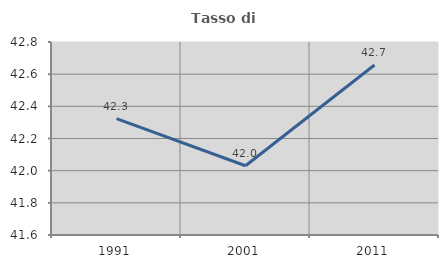
| Category | Tasso di occupazione   |
|---|---|
| 1991.0 | 42.324 |
| 2001.0 | 42.031 |
| 2011.0 | 42.657 |